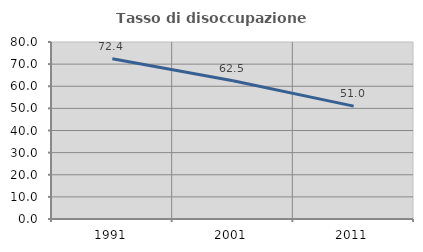
| Category | Tasso di disoccupazione giovanile  |
|---|---|
| 1991.0 | 72.441 |
| 2001.0 | 62.5 |
| 2011.0 | 51.02 |